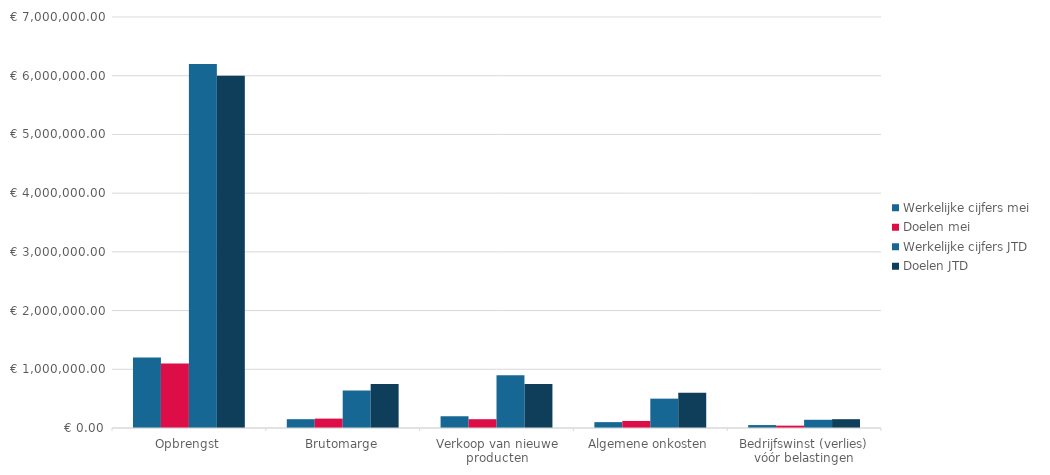
| Category | Werkelijke cijfers mei | Doelen mei | Werkelijke cijfers JTD | Doelen JTD |
|---|---|---|---|---|
| Opbrengst | 1200000 | 1100000 | 6200000 | 6000000 |
| Brutomarge | 150000 | 160000 | 640000 | 750000 |
| Verkoop van nieuwe producten | 200000 | 150000 | 900000 | 750000 |
| Algemene onkosten | 100000 | 120000 | 500000 | 600000 |
| Bedrijfswinst (verlies) vóór belastingen | 50000 | 40000 | 140000 | 150000 |